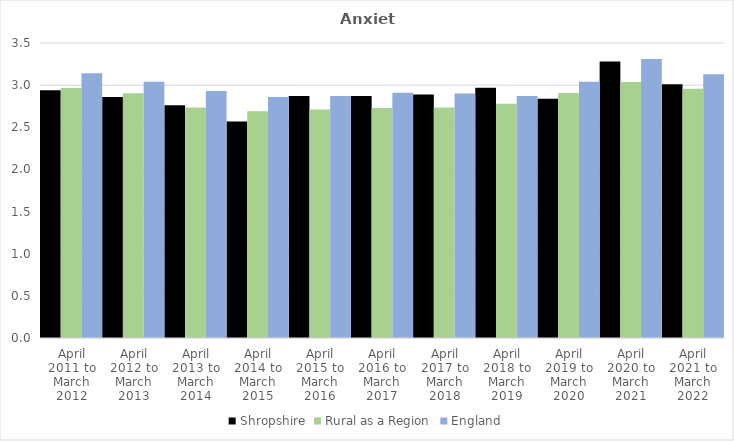
| Category | Shropshire | Rural as a Region | England |
|---|---|---|---|
| April 2011 to March 2012 | 2.94 | 2.967 | 3.14 |
| April 2012 to March 2013 | 2.86 | 2.904 | 3.04 |
| April 2013 to March 2014 | 2.76 | 2.734 | 2.93 |
| April 2014 to March 2015 | 2.57 | 2.691 | 2.86 |
| April 2015 to March 2016 | 2.87 | 2.711 | 2.87 |
| April 2016 to March 2017 | 2.87 | 2.729 | 2.91 |
| April 2017 to March 2018 | 2.89 | 2.736 | 2.9 |
| April 2018 to March 2019 | 2.97 | 2.78 | 2.87 |
| April 2019 to March 2020 | 2.84 | 2.908 | 3.04 |
| April 2020 to March 2021 | 3.28 | 3.036 | 3.31 |
| April 2021 to March 2022 | 3.01 | 2.956 | 3.13 |